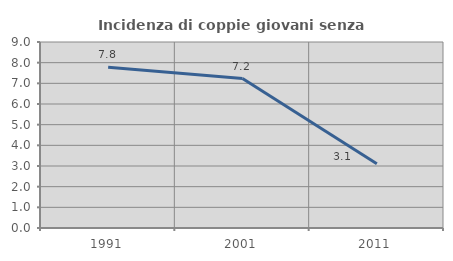
| Category | Incidenza di coppie giovani senza figli |
|---|---|
| 1991.0 | 7.783 |
| 2001.0 | 7.232 |
| 2011.0 | 3.109 |